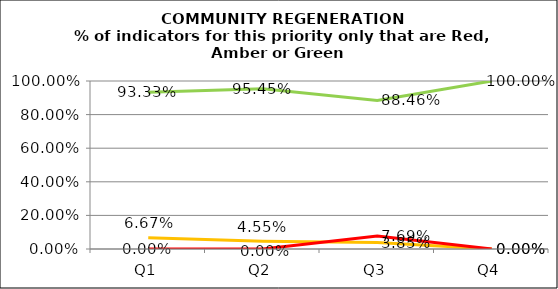
| Category | Green | Amber | Red |
|---|---|---|---|
| Q1 | 0.933 | 0.067 | 0 |
| Q2 | 0.955 | 0.045 | 0 |
| Q3 | 0.885 | 0.038 | 0.077 |
| Q4 | 1 | 0 | 0 |